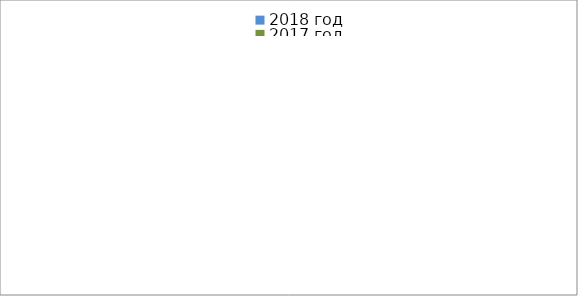
| Category | 2018 год | 2017 год |
|---|---|---|
|  - поджог | 18 | 24 |
|  - неосторожное обращение с огнём | 17 | 6 |
|  - НПТЭ электрооборудования | 22 | 28 |
|  - НПУ и Э печей | 84 | 66 |
|  - НПУ и Э транспортных средств | 65 | 50 |
|   -Шалость с огнем детей | 5 | 4 |
|  -НППБ при эксплуатации эл.приборов | 39 | 38 |
|  - курение | 37 | 56 |
| - прочие | 78 | 87 |
| - не установленные причины | 0 | 0 |